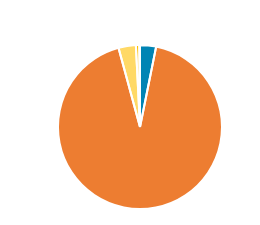
| Category | Series 0 |
|---|---|
|  | 527 |
|  | 15459 |
|  | 570 |
|  | 111 |
|  | 23 |